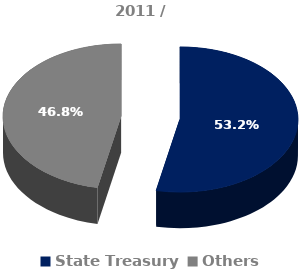
| Category | Struktura akcjonariatu 2011 |
|---|---|
| State Treasury | 0.532 |
| Others | 0.468 |